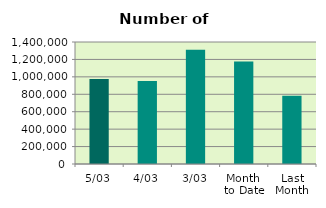
| Category | Series 0 |
|---|---|
| 5/03 | 974390 |
| 4/03 | 951780 |
| 3/03 | 1311298 |
| Month 
to Date | 1177291.5 |
| Last
Month | 783511.9 |